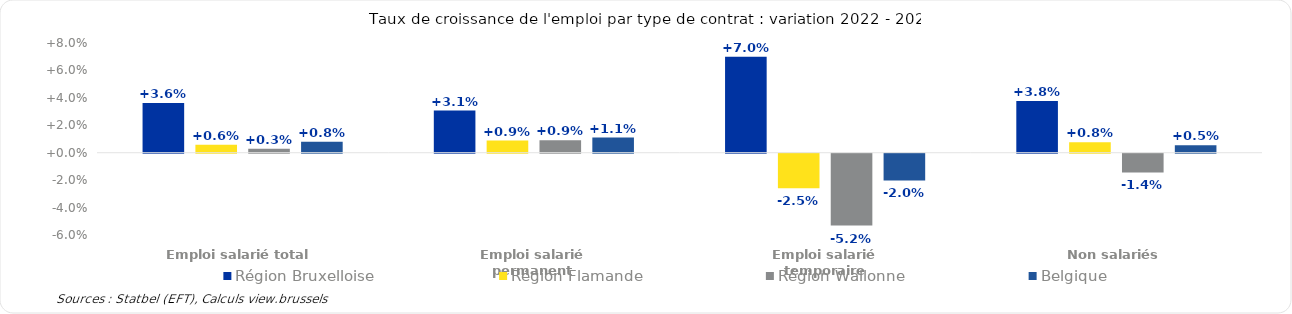
| Category | Région Bruxelloise | Région Flamande | Région Wallonne | Belgique |
|---|---|---|---|---|
| Emploi salarié total | 0.036 | 0.006 | 0.003 | 0.008 |
| Emploi salarié permanent | 0.031 | 0.009 | 0.009 | 0.011 |
| Emploi salarié temporaire | 0.07 | -0.025 | -0.052 | -0.02 |
| Non salariés | 0.038 | 0.008 | -0.014 | 0.005 |